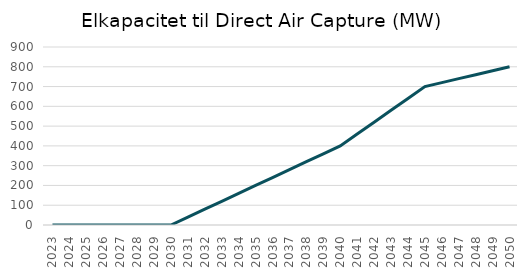
| Category | DAC |
|---|---|
| 2023.0 | 0 |
| 2024.0 | 0 |
| 2025.0 | 0 |
| 2026.0 | 0 |
| 2027.0 | 0 |
| 2028.0 | 0 |
| 2029.0 | 0 |
| 2030.0 | 0 |
| 2031.0 | 40 |
| 2032.0 | 80 |
| 2033.0 | 120 |
| 2034.0 | 160 |
| 2035.0 | 200 |
| 2036.0 | 240 |
| 2037.0 | 280 |
| 2038.0 | 320 |
| 2039.0 | 360 |
| 2040.0 | 400 |
| 2041.0 | 460 |
| 2042.0 | 520 |
| 2043.0 | 580 |
| 2044.0 | 640 |
| 2045.0 | 700 |
| 2046.0 | 720 |
| 2047.0 | 740 |
| 2048.0 | 760 |
| 2049.0 | 780 |
| 2050.0 | 800 |